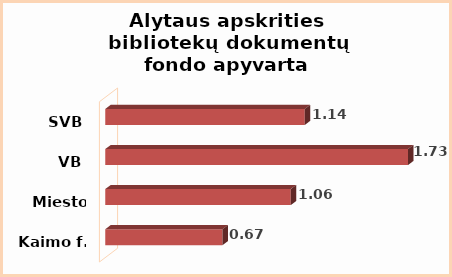
| Category | Series 0 |
|---|---|
| Kaimo f. | 0.67 |
| Miesto f. | 1.06 |
| VB | 1.73 |
| SVB | 1.14 |